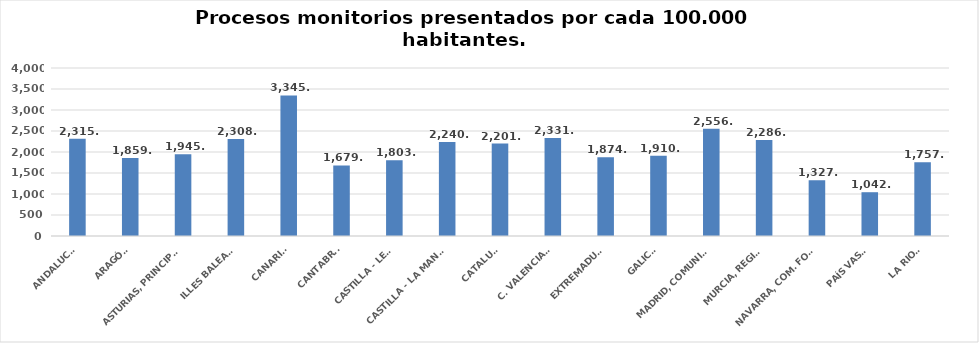
| Category | Series 0 |
|---|---|
| ANDALUCÍA | 2315.435 |
| ARAGÓN | 1859.222 |
| ASTURIAS, PRINCIPADO | 1945.748 |
| ILLES BALEARS | 2308.478 |
| CANARIAS | 3345.604 |
| CANTABRIA | 1679.102 |
| CASTILLA - LEÓN | 1803.27 |
| CASTILLA - LA MANCHA | 2240.433 |
| CATALUÑA | 2201.149 |
| C. VALENCIANA | 2331.367 |
| EXTREMADURA | 1874.315 |
| GALICIA | 1910.053 |
| MADRID, COMUNIDAD | 2556.112 |
| MURCIA, REGIÓN | 2286.618 |
| NAVARRA, COM. FORAL | 1327.581 |
| PAÍS VASCO | 1042.61 |
| LA RIOJA | 1757.571 |